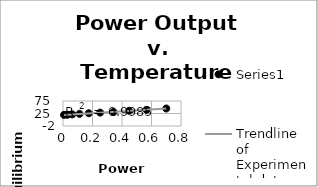
| Category | Series 0 |
|---|---|
| 0.007000000000000001 | 19.5 |
| 0.03 | 20 |
| 0.063 | 21.5 |
| 0.11200000000000002 | 23.5 |
| 0.175 | 26 |
| 0.252 | 28.5 |
| 0.34299999999999997 | 31 |
| 0.44800000000000006 | 36 |
| 0.5670000000000001 | 40 |
| 0.7 | 45 |